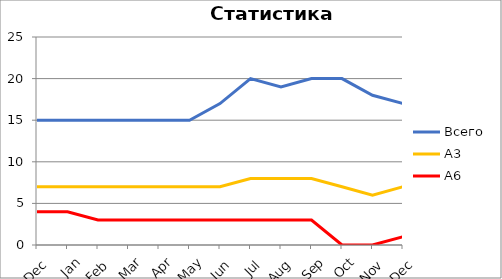
| Category | Всего | А3 | A6 |
|---|---|---|---|
| 0 | 15 | 7 | 4 |
| 1 | 15 | 7 | 4 |
| 2 | 15 | 7 | 3 |
| 3 | 15 | 7 | 3 |
| 4 | 15 | 7 | 3 |
| 5 | 15 | 7 | 3 |
| 6 | 17 | 7 | 3 |
| 7 | 20 | 8 | 3 |
| 8 | 19 | 8 | 3 |
| 9 | 20 | 8 | 3 |
| 10 | 20 | 7 | 0 |
| 11 | 18 | 6 | 0 |
| 12 | 17 | 7 | 1 |